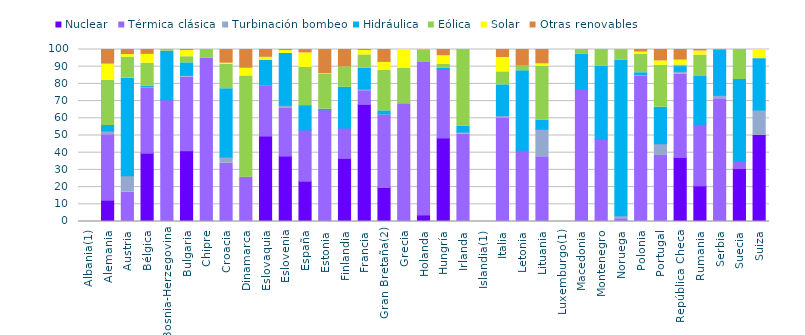
| Category | Nuclear | Térmica clásica | Turbinación bombeo | Hidráulica | Eólica | Solar | Otras renovables |
|---|---|---|---|---|---|---|---|
| Albania(1) | 0 | 0 | 0 | 0 | 0 | 0 | 0 |
| Alemania | 12.371 | 38.117 | 2.146 | 3.164 | 26.391 | 9.304 | 8.506 |
| Austria | 0 | 17.104 | 9.52 | 56.701 | 12.223 | 1.559 | 2.893 |
| Bélgica | 39.609 | 37.72 | 1.248 | 0.181 | 13.235 | 5.145 | 2.863 |
| Bosnia-Herzegovina | 0 | 70.746 | 0 | 28.24 | 1.013 | 0 | 0 |
| Bulgaria | 41.126 | 42.765 | 1.115 | 7.226 | 3.568 | 3.569 | 0.63 |
| Chipre | 0 | 94.831 | 0 | 0 | 5.169 | 0 | 0 |
| Croacia | 0 | 33.872 | 3.596 | 39.72 | 14.189 | 0.646 | 7.977 |
| Dinamarca | 0 | 25.782 | 0 | 0 | 58.832 | 4.473 | 10.914 |
| Eslovaquia | 49.673 | 28.869 | 0.779 | 14.444 | 0.012 | 1.674 | 4.549 |
| Eslovenia | 38.029 | 27.709 | 1.822 | 30.134 | 0.033 | 1.648 | 0.626 |
| España | 23.384 | 29.86 | 0 | 14.117 | 22.27 | 8.392 | 1.926 |
| Estonia | 0 | 64.958 | 0 | 0.297 | 20.211 | 0.373 | 14.16 |
| Finlandia | 36.677 | 17.639 | 0 | 23.678 | 11.858 | 0 | 10.149 |
| Francia | 68.056 | 7.976 | 1.027 | 12.007 | 7.806 | 2.535 | 0.594 |
| Gran Bretaña(2) | 19.784 | 42.07 | 0.665 | 1.801 | 23.481 | 4.694 | 7.505 |
| Grecia | 0 | 68.405 | 0 | 0 | 20.614 | 10.981 | 0 |
| Holanda | 3.778 | 88.666 | 0 | 0 | 7.326 | 0.099 | 0.132 |
| Hungría | 48.574 | 39.918 | 0 | 0.729 | 2.042 | 5.117 | 3.619 |
| Irlanda | 0 | 50.9 | 1.178 | 3.453 | 44.469 | 0 | 0 |
| Islandia(1) | 0 | 0 | 0 | 0 | 0 | 0 | 0 |
| Italia | 0 | 60.119 | 1.453 | 17.873 | 7.566 | 8.338 | 4.651 |
| Letonia | 0 | 41.433 | 0 | 46.174 | 2.731 | 0 | 9.661 |
| Lituania | 0 | 37.631 | 16.014 | 5.381 | 31.081 | 1.532 | 8.362 |
| Luxemburgo(1) | 0 | 0 | 0 | 0 | 0 | 0 | 0 |
| Macedonia | 0 | 77.112 | 0 | 20.278 | 2.611 | 0 | 0 |
| Montenegro | 0 | 47.809 | 0 | 42.367 | 9.823 | 0 | 0 |
| Noruega | 0 | 1.607 | 1.694 | 90.539 | 6.082 | 0 | 0.078 |
| Polonia | 0 | 84.592 | 0.753 | 1.151 | 10.777 | 1.25 | 1.476 |
| Portugal | 0 | 38.447 | 6.763 | 21.232 | 24.364 | 2.563 | 6.631 |
| República Checa | 37.236 | 48.379 | 1.706 | 2.747 | 0.901 | 2.837 | 6.195 |
| Rumania | 20.737 | 35.729 | 0 | 27.819 | 12.428 | 2.422 | 0.866 |
| Serbia | 0 | 71.33 | 2.05 | 26.125 | 0 | 0 | 0.495 |
| Suecia | 30.77 | 4.415 | 0 | 47.398 | 17.417 | 0 | 0 |
| Suiza | 50.086 | 0 | 14.745 | 29.817 | 0.273 | 5.079 | 0 |